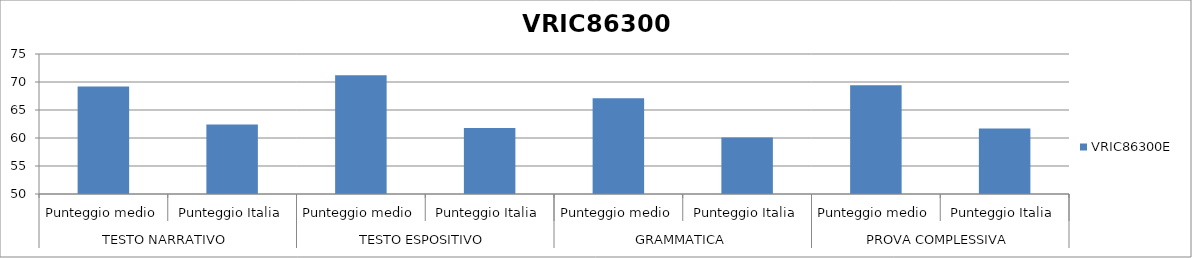
| Category | VRIC86300E |
|---|---|
| 0 | 69.2 |
| 1 | 62.4 |
| 2 | 71.2 |
| 3 | 61.8 |
| 4 | 67.1 |
| 5 | 60.1 |
| 6 | 69.4 |
| 7 | 61.7 |